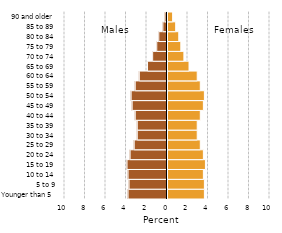
| Category | Female |
|---|---|
| Younger than 5 | 3.6 |
| 5 to 9 | 3.6 |
| 10 to 14 | 3.5 |
| 15 to 19 | 3.7 |
| 20 to 24 | 3.5 |
| 25 to 29 | 3.2 |
| 30 to 34 | 2.9 |
| 35 to 39 | 2.9 |
| 40 to 44 | 3.2 |
| 45 to 49 | 3.5 |
| 50 to 54 | 3.6 |
| 55 to 59 | 3.2 |
| 60 to 64 | 2.9 |
| 65 to 69 | 2.1 |
| 70 to 74 | 1.6 |
| 75 to 79 | 1.3 |
| 80 to 84 | 1.1 |
| 85 to 89 | 0.8 |
| 90 and older | 0.5 |